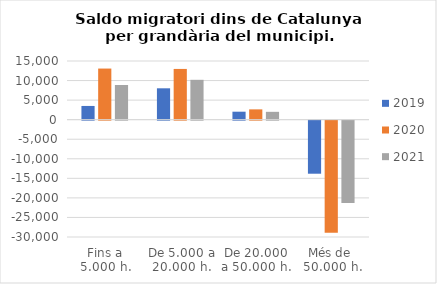
| Category | 2019 | 2020 | 2021 |
|---|---|---|---|
| Fins a 5.000 h. | 3506 | 13068 | 8859 |
| De 5.000 a 20.000 h. | 8019 | 12972 | 10191 |
| De 20.000 a 50.000 h. | 2039 | 2634 | 2005 |
| Més de 
50.000 h. | -13564 | -28674 | -21055 |